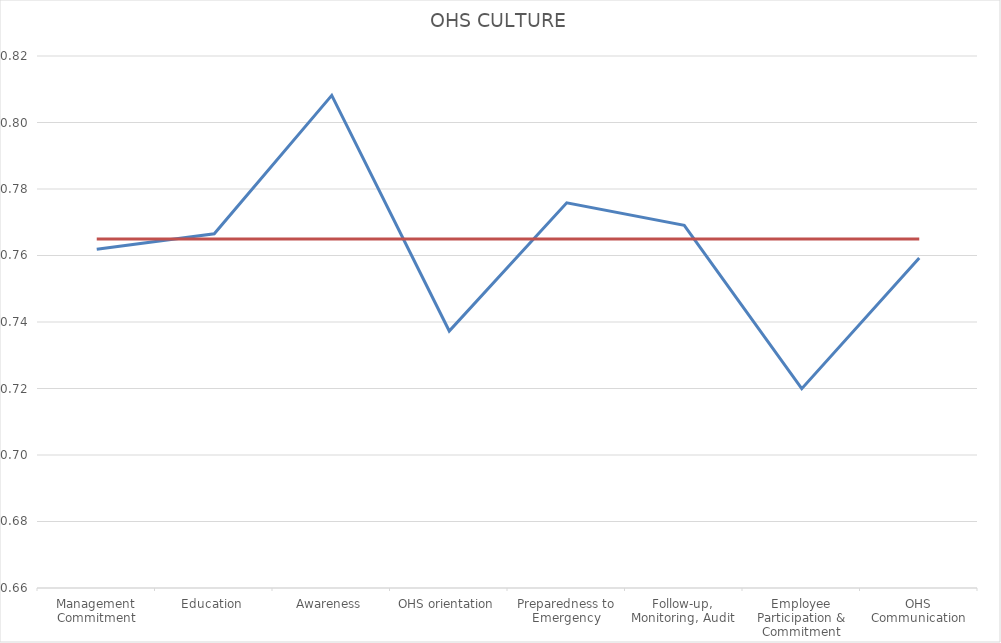
| Category | Series 0 | Series 1 |
|---|---|---|
| Management Commitment | 0.762 | 0.765 |
| Education | 0.767 | 0.765 |
| Awareness | 0.808 | 0.765 |
| OHS orientation | 0.737 | 0.765 |
| Preparedness to Emergency | 0.776 | 0.765 |
| Follow-up, Monitoring, Audit | 0.769 | 0.765 |
| Employee Participation & Commitment | 0.72 | 0.765 |
| OHS Communication | 0.759 | 0.765 |